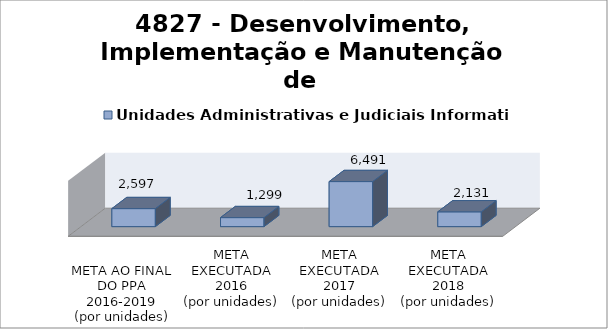
| Category | Unidades Administrativas e Judiciais Informatizadas |
|---|---|
| 
META AO FINAL
DO PPA
2016-2019
(por unidades)
 | 2597 |
| META EXECUTADA
2016
(por unidades) | 1299 |
| META EXECUTADA
2017
(por unidades) | 6491 |
| META EXECUTADA
2018
(por unidades) | 2131 |